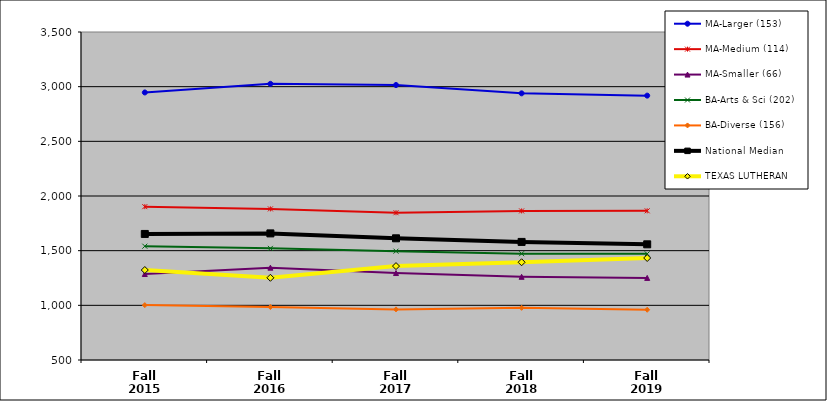
| Category | MA-Larger (153) | MA-Medium (114) | MA-Smaller (66) | BA-Arts & Sci (202) | BA-Diverse (156) | National Median | TEXAS LUTHERAN |
|---|---|---|---|---|---|---|---|
| Fall 2015 | 2947 | 1902.5 | 1286.5 | 1541 | 1002 | 1653 | 1323 |
| Fall 2016 | 3026 | 1882 | 1344.5 | 1521 | 984.5 | 1658 | 1252 |
| Fall 2017 | 3015 | 1847 | 1295.5 | 1495.5 | 963 | 1613 | 1359 |
| Fall 2018 | 2939 | 1863.5 | 1261 | 1472.5 | 977 | 1580 | 1394 |
| Fall 2019 | 2918 | 1864.5 | 1251 | 1471 | 959.5 | 1558 | 1433 |